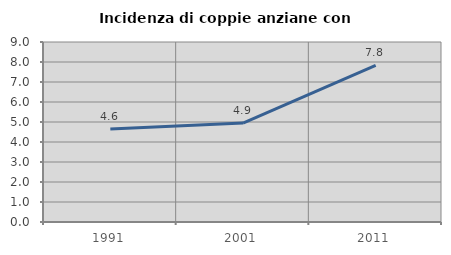
| Category | Incidenza di coppie anziane con figli |
|---|---|
| 1991.0 | 4.644 |
| 2001.0 | 4.947 |
| 2011.0 | 7.834 |